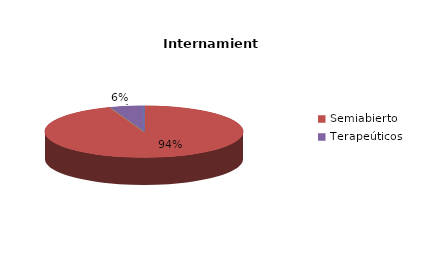
| Category | Series 0 |
|---|---|
| Cerrado | 0 |
| Semiabierto | 17 |
| Abierto | 0 |
| Terapeúticos | 1 |